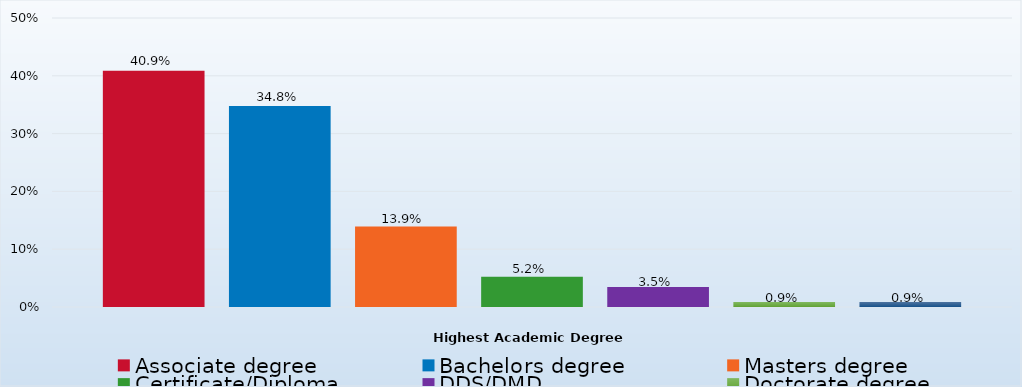
| Category | Associate degree | Bachelors degree | Masters degree | Certificate/Diploma | DDS/DMD | Doctorate degree | Other |
|---|---|---|---|---|---|---|---|
| Percent | 0.409 | 0.348 | 0.139 | 0.052 | 0.035 | 0.009 | 0.009 |